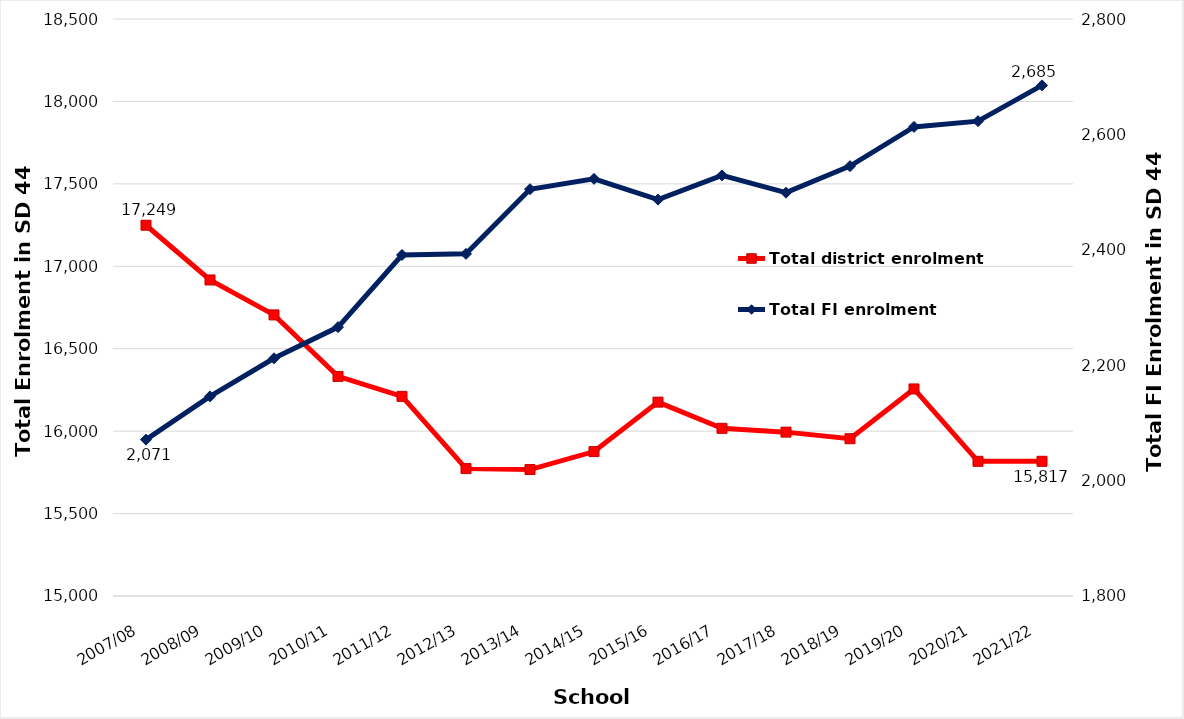
| Category | Total district enrolment  |
|---|---|
| 2007/08 | 17249 |
| 2008/09 | 16917 |
| 2009/10 | 16705 |
| 2010/11 | 16332 |
| 2011/12 | 16211 |
| 2012/13 | 15773 |
| 2013/14 | 15767 |
| 2014/15 | 15876 |
| 2015/16 | 16176 |
| 2016/17 | 16017 |
| 2017/18 | 15994 |
| 2018/19 | 15954 |
| 2019/20 | 16256 |
| 2020/21 | 15817 |
| 2021/22 | 15817 |